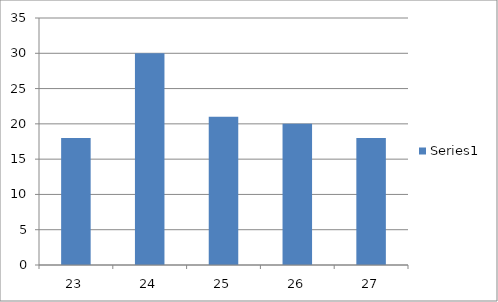
| Category | Series 0 |
|---|---|
| 23.0 | 18 |
| 24.0 | 30 |
| 25.0 | 21 |
| 26.0 | 20 |
| 27.0 | 18 |